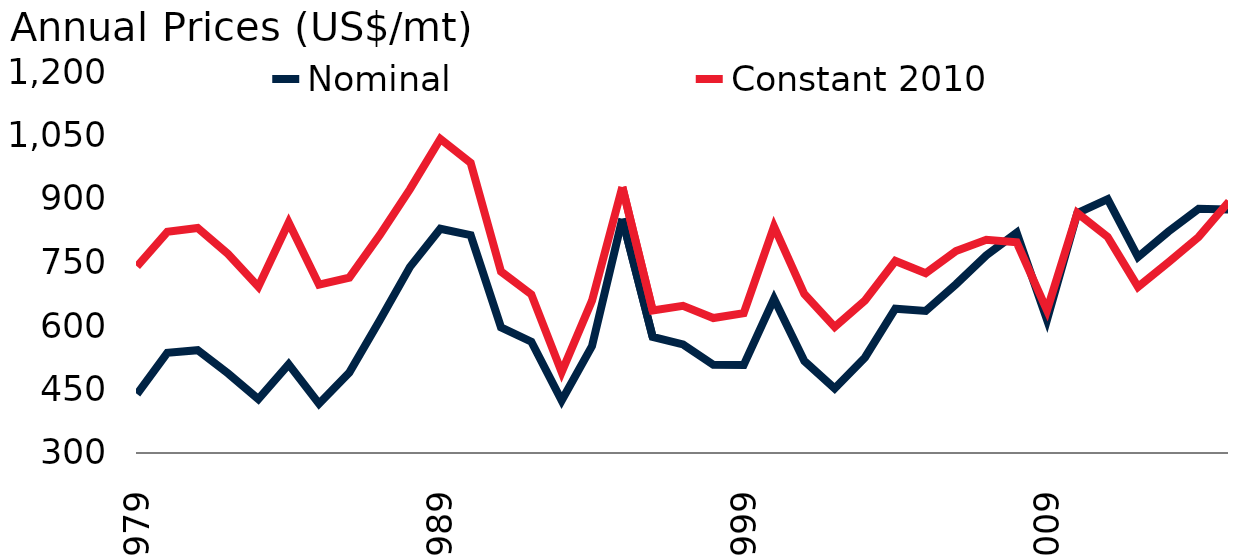
| Category | Nominal | Constant 2010 |
|---|---|---|
| 1979.0 | 439.331 | 740.879 |
| 1980.0 | 536.542 | 822.609 |
| 1981.0 | 542.917 | 831.434 |
| 1982.0 | 487.921 | 770.151 |
| 1983.0 | 427.164 | 692.618 |
| 1984.0 | 509.282 | 844.349 |
| 1985.0 | 416.325 | 697.507 |
| 1986.0 | 490.277 | 714.161 |
| 1987.0 | 612.866 | 814.654 |
| 1988.0 | 739.658 | 923.267 |
| 1989.0 | 829.709 | 1041.914 |
| 1990.0 | 814.516 | 985.234 |
| 1991.0 | 596.798 | 728.583 |
| 1992.0 | 562.951 | 674.652 |
| 1993.0 | 423.911 | 491.077 |
| 1994.0 | 552.462 | 659.815 |
| 1995.0 | 853.453 | 928.474 |
| 1996.0 | 574.118 | 636.716 |
| 1997.0 | 556.502 | 647.681 |
| 1998.0 | 508.434 | 618.752 |
| 1999.0 | 507.774 | 630.06 |
| 2000.0 | 664.282 | 834.949 |
| 2001.0 | 517.298 | 675.527 |
| 2002.0 | 452.312 | 597.642 |
| 2003.0 | 525.667 | 660.237 |
| 2004.0 | 640.794 | 753.644 |
| 2005.0 | 635.477 | 724.568 |
| 2006.0 | 698.602 | 776.862 |
| 2007.0 | 766.963 | 803.694 |
| 2008.0 | 820.164 | 797.562 |
| 2009.0 | 614.6 | 637.141 |
| 2010.0 | 866.795 | 866.795 |
| 2011.0 | 899.648 | 810.525 |
| 2012.0 | 762.844 | 692.392 |
| 2013.0 | 823.075 | 750.334 |
| 2014.0 | 876.914 | 810.326 |
| 2015.0 | 875 | 894.153 |